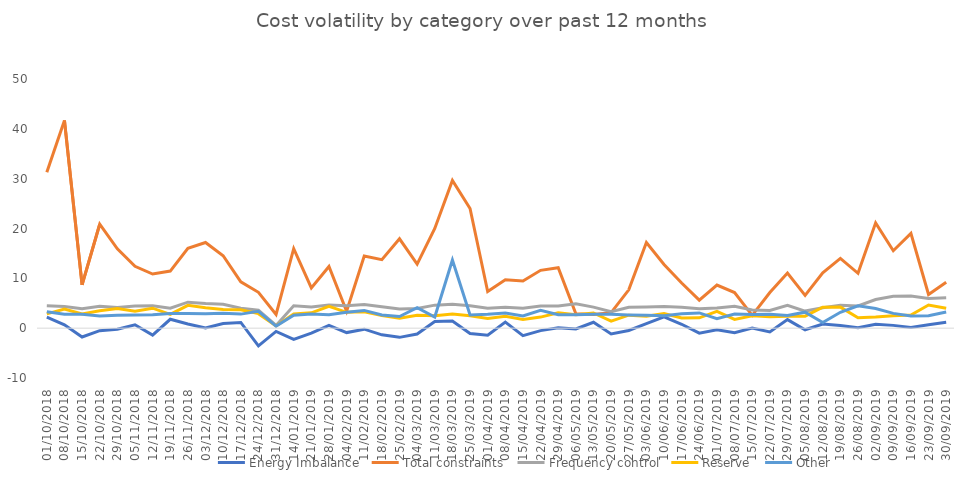
| Category | Energy Imbalance | Total constraints | Frequency control | Reserve | Other |
|---|---|---|---|---|---|
| 01/10/2018 | 2.195 | 31.287 | 4.498 | 2.875 | 3.3 |
| 08/10/2018 | 0.668 | 41.68 | 4.348 | 3.818 | 2.784 |
| 15/10/2018 | -1.775 | 8.692 | 3.91 | 2.86 | 2.81 |
| 22/10/2018 | -0.496 | 20.854 | 4.383 | 3.487 | 2.424 |
| 29/10/2018 | -0.232 | 15.927 | 4.155 | 3.957 | 2.586 |
| 05/11/2018 | 0.67 | 12.415 | 4.43 | 3.411 | 2.632 |
| 12/11/2018 | -1.388 | 10.865 | 4.507 | 4.012 | 2.709 |
| 19/11/2018 | 1.785 | 11.454 | 4.019 | 2.768 | 2.941 |
| 26/11/2018 | 0.823 | 16.026 | 5.214 | 4.575 | 2.931 |
| 03/12/2018 | 0.029 | 17.185 | 4.958 | 4.085 | 2.875 |
| 10/12/2018 | 0.917 | 14.545 | 4.812 | 3.744 | 2.988 |
| 17/12/2018 | 1.143 | 9.287 | 4.007 | 3.672 | 2.821 |
| 24/12/2018 | -3.57 | 7.192 | 3.6 | 2.913 | 3.397 |
| 31/12/2018 | -0.66 | 2.761 | 0.557 | 0.442 | 0.411 |
| 14/01/2019 | -2.271 | 15.948 | 4.503 | 2.848 | 2.612 |
| 21/01/2019 | -0.986 | 8.069 | 4.236 | 3.076 | 2.825 |
| 28/01/2019 | 0.548 | 12.368 | 4.671 | 4.362 | 2.687 |
| 04/02/2019 | -0.888 | 3.384 | 4.498 | 3.178 | 3.191 |
| 11/02/2019 | -0.205 | 14.489 | 4.751 | 3.299 | 3.563 |
| 18/02/2019 | -1.342 | 13.752 | 4.289 | 2.515 | 2.635 |
| 25/02/2019 | -1.843 | 17.932 | 3.829 | 1.998 | 2.336 |
| 04/03/2019 | -1.174 | 12.864 | 3.928 | 2.569 | 4.103 |
| 11/03/2019 | 1.325 | 19.999 | 4.619 | 2.513 | 2.247 |
| 18/03/2019 | 1.423 | 29.65 | 4.798 | 2.844 | 13.688 |
| 25/03/2019 | -1.072 | 24.004 | 4.487 | 2.484 | 2.658 |
| 01/04/2019 | -1.405 | 7.368 | 4.017 | 1.95 | 2.778 |
| 08/04/2019 | 1.223 | 9.701 | 4.211 | 2.364 | 3.019 |
| 15/04/2019 | -1.495 | 9.463 | 4.007 | 1.761 | 2.442 |
| 22/04/2019 | -0.491 | 11.609 | 4.467 | 2.223 | 3.588 |
| 29/04/2019 | 0.058 | 12.122 | 4.442 | 3.095 | 2.711 |
| 06/05/2019 | -0.143 | 2.905 | 4.911 | 2.705 | 2.698 |
| 13/05/2019 | 1.189 | 2.744 | 4.226 | 3.061 | 2.786 |
| 20/05/2019 | -1.146 | 3.116 | 3.288 | 1.404 | 2.793 |
| 27/05/2019 | -0.467 | 7.685 | 4.18 | 2.612 | 2.661 |
| 03/06/2019 | 0.907 | 17.187 | 4.226 | 2.412 | 2.606 |
| 10/06/2019 | 2.27 | 12.768 | 4.332 | 2.932 | 2.514 |
| 17/06/2019 | 0.786 | 9.062 | 4.185 | 2.042 | 2.9 |
| 24/06/2019 | -1.01 | 5.618 | 3.898 | 2.074 | 3.066 |
| 01/07/2019 | -0.309 | 8.651 | 4.027 | 3.355 | 1.904 |
| 08/07/2019 | -0.918 | 7.157 | 4.38 | 1.755 | 2.843 |
| 15/07/2019 | 0.013 | 2.561 | 3.651 | 2.467 | 2.743 |
| 22/07/2019 | -0.771 | 7.14 | 3.547 | 2.281 | 2.806 |
| 29/07/2019 | 1.713 | 11.07 | 4.58 | 2.373 | 2.542 |
| 05/08/2019 | -0.328 | 6.58 | 3.425 | 2.409 | 3.21 |
| 12/08/2019 | 0.817 | 11.128 | 4.076 | 4.221 | 1.135 |
| 19/08/2019 | 0.553 | 13.989 | 4.614 | 4.229 | 3.191 |
| 26/08/2019 | 0.096 | 11.006 | 4.471 | 2.078 | 4.47 |
| 02/09/2019 | 0.803 | 21.129 | 5.743 | 2.23 | 3.942 |
| 09/09/2019 | 0.561 | 15.54 | 6.402 | 2.503 | 2.97 |
| 16/09/2019 | 0.143 | 19.02 | 6.444 | 2.63 | 2.457 |
| 23/09/2019 | 0.69 | 6.763 | 5.977 | 4.635 | 2.505 |
| 30/09/2019 | 1.167 | 9.211 | 6.109 | 3.979 | 3.25 |